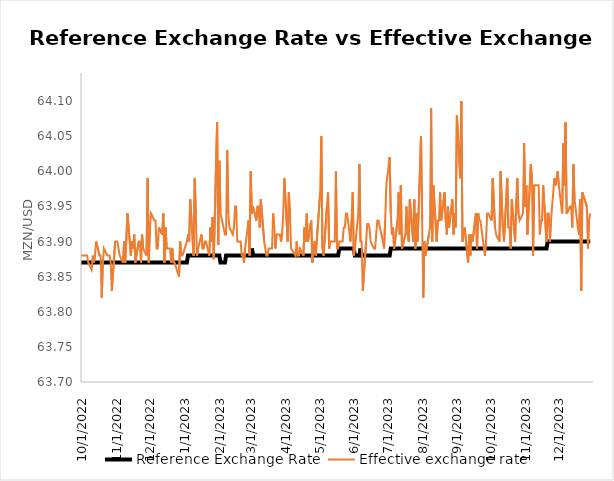
| Category | Reference Exchange Rate | Effective exchange rate |
|---|---|---|
| 10/1/21 | 63.83 | 63.8 |
| 10/5/21 | 63.83 | 63.83 |
| 10/6/21 | 63.83 | 63.76 |
| 10/7/21 | 63.83 | 63.82 |
| 10/8/21 | 63.83 | 63.82 |
| 10/11/21 | 63.83 | 63.77 |
| 10/12/21 | 63.83 | 63.81 |
| 10/13/21 | 63.83 | 63.82 |
| 10/14/21 | 63.83 | 63.82 |
| 10/15/21 | 63.83 | 63.82 |
| 10/18/21 | 63.83 | 63.76 |
| 10/19/21 | 63.83 | 63.76 |
| 10/20/21 | 63.83 | 63.82 |
| 10/21/21 | 63.83 | 63.78 |
| 10/22/21 | 63.83 | 63.81 |
| 10/25/21 | 63.83 | 63.82 |
| 10/26/21 | 63.83 | 63.79 |
| 10/27/21 | 63.83 | 63.8 |
| 10/28/21 | 63.83 | 63.83 |
| 10/29/21 | 63.83 | 63.82 |
| 11/1/21 | 63.83 | 63.84 |
| 11/2/21 | 63.83 | 63.81 |
| 11/3/21 | 63.83 | 63.83 |
| 11/4/21 | 63.83 | 63.82 |
| 11/5/21 | 63.83 | 63.83 |
| 11/8/21 | 63.83 | 63.79 |
| 11/9/21 | 63.83 | 63.79 |
| 11/11/21 | 63.83 | 63.84 |
| 11/12/21 | 63.83 | 63.83 |
| 11/15/21 | 63.83 | 63.78 |
| 11/16/21 | 63.83 | 63.7 |
| 11/17/21 | 63.83 | 63.84 |
| 11/18/21 | 63.83 | 63.81 |
| 11/19/21 | 63.83 | 63.8 |
| 11/22/21 | 63.83 | 63.78 |
| 11/23/21 | 63.83 | 63.81 |
| 11/24/21 | 63.83 | 63.81 |
| 11/25/21 | 63.83 | 63.81 |
| 11/26/21 | 63.83 | 63.84 |
| 11/29/21 | 63.83 | 63.8 |
| 11/30/21 | 63.83 | 63.81 |
| 12/1/21 | 63.83 | 63.79 |
| 12/2/21 | 63.83 | 63.79 |
| 12/3/21 | 63.83 | 63.82 |
| 12/6/21 | 63.83 | 63.75 |
| 12/7/21 | 63.83 | 63.78 |
| 12/8/21 | 63.83 | 63.82 |
| 12/9/21 | 63.83 | 63.82 |
| 12/10/21 | 63.83 | 63.82 |
| 12/13/21 | 63.83 | 63.83 |
| 12/14/21 | 63.83 | 63.76 |
| 12/15/21 | 63.83 | 63.82 |
| 12/16/21 | 63.83 | 63.8 |
| 12/17/21 | 63.83 | 63.79 |
| 12/20/21 | 63.83 | 63.84 |
| 12/21/21 | 63.83 | 63.79 |
| 12/22/21 | 63.83 | 63.8 |
| 12/23/21 | 63.83 | 63.82 |
| 12/27/21 | 63.83 | 63.77 |
| 12/28/21 | 63.83 | 63.74 |
| 12/29/21 | 63.83 | 63.76 |
| 12/30/21 | 63.83 | 63.78 |
| 12/31/21 | 63.83 | 63.72 |
| 1/3/22 | 63.83 | 63.79 |
| 1/4/22 | 63.83 | 63.81 |
| 1/5/22 | 63.83 | 63.8 |
| 1/6/22 | 63.83 | 63.81 |
| 1/7/22 | 63.83 | 63.77 |
| 1/10/22 | 63.83 | 63.79 |
| 1/12/22 | 63.83 | 63.83 |
| 1/13/22 | 63.83 | 63.83 |
| 1/14/22 | 63.83 | 63.83 |
| 1/17/22 | 63.83 | 63.83 |
| 1/18/22 | 63.83 | 63.83 |
| 1/19/22 | 63.83 | 63.8 |
| 1/20/22 | 63.83 | 63.83 |
| 1/21/22 | 63.83 | 63.83 |
| 1/24/22 | 63.83 | 63.81 |
| 1/25/22 | 63.83 | 63.82 |
| 1/26/22 | 63.83 | 63.83 |
| 1/27/22 | 63.83 | 63.8 |
| 1/28/22 | 63.83 | 63.83 |
| 1/31/22 | 63.83 | 63.81 |
| 2/1/22 | 63.83 | 63.83 |
| 2/2/22 | 63.83 | 63.82 |
| 2/3/22 | 63.83 | 63.78 |
| 2/4/22 | 63.83 | 63.84 |
| 2/7/22 | 63.83 | 63.83 |
| 2/8/22 | 63.83 | 63.85 |
| 2/9/22 | 63.83 | 63.8 |
| 2/10/22 | 63.83 | 63.83 |
| 2/11/22 | 63.83 | 63.83 |
| 2/14/22 | 63.83 | 63.83 |
| 2/15/22 | 63.83 | 63.81 |
| 2/16/22 | 63.83 | 63.81 |
| 2/17/22 | 63.83 | 63.83 |
| 2/18/22 | 63.83 | 63.83 |
| 2/21/22 | 63.83 | 63.84 |
| 2/22/22 | 63.83 | 63.83 |
| 2/23/22 | 63.83 | 63.83 |
| 2/24/22 | 63.83 | 63.81 |
| 2/25/22 | 63.83 | 63.82 |
| 2/28/22 | 63.83 | 63.83 |
| 3/1/22 | 63.83 | 63.79 |
| 3/2/22 | 63.83 | 63.81 |
| 3/3/22 | 63.83 | 63.83 |
| 3/4/22 | 63.83 | 63.83 |
| 3/7/22 | 63.83 | 63.82 |
| 3/8/22 | 63.83 | 63.83 |
| 3/9/22 | 63.83 | 63.76 |
| 3/10/22 | 63.83 | 63.82 |
| 3/11/22 | 63.83 | 63.83 |
| 3/14/22 | 63.83 | 63.83 |
| 3/15/22 | 63.83 | 63.82 |
| 3/16/22 | 63.83 | 63.82 |
| 3/17/22 | 63.83 | 63.82 |
| 3/18/22 | 63.83 | 63.84 |
| 3/21/22 | 63.83 | 63.8 |
| 3/22/22 | 63.83 | 63.8 |
| 3/23/22 | 63.83 | 63.82 |
| 3/24/22 | 63.83 | 63.84 |
| 3/25/22 | 63.83 | 63.83 |
| 3/28/22 | 63.83 | 63.73 |
| 3/29/22 | 63.83 | 63.88 |
| 3/30/22 | 63.83 | 63.82 |
| 3/31/22 | 63.83 | 63.84 |
| 4/1/22 | 63.83 | 63.83 |
| 4/4/22 | 63.83 | 63.83 |
| 4/5/22 | 63.83 | 63.84 |
| 4/6/22 | 63.83 | 63.83 |
| 4/8/22 | 63.83 | 63.83 |
| 4/11/22 | 63.83 | 63.83 |
| 4/12/22 | 63.83 | 63.77 |
| 4/13/22 | 63.83 | 63.83 |
| 4/14/22 | 63.83 | 63.83 |
| 4/18/22 | 63.83 | 63.83 |
| 4/19/22 | 63.83 | 63.83 |
| 4/20/22 | 63.83 | 63.84 |
| 4/21/22 | 63.83 | 63.85 |
| 4/22/22 | 63.83 | 63.83 |
| 4/25/20 | 63.83 | 63.81 |
| 4/26/22 | 63.83 | 63.83 |
| 4/27/22 | 63.83 | 63.82 |
| 4/28/22 | 63.83 | 63.83 |
| 4/29/22 | 63.83 | 63.83 |
| 5/3/22 | 63.83 | 63.83 |
| 5/4/22 | 63.83 | 63.84 |
| 5/5/22 | 63.83 | 63.82 |
| 5/6/22 | 63.83 | 63.82 |
| 5/9/22 | 63.83 | 63.82 |
| 5/10/22 | 63.83 | 63.83 |
| 5/11/22 | 63.83 | 63.83 |
| 5/12/22 | 63.83 | 63.79 |
| 5/13/22 | 63.83 | 63.83 |
| 5/16/22 | 63.83 | 63.85 |
| 5/17/22 | 63.83 | 63.82 |
| 5/18/22 | 63.83 | 63.83 |
| 5/19/22 | 63.83 | 63.83 |
| 5/20/22 | 63.83 | 63.84 |
| 5/23/22 | 63.83 | 63.84 |
| 5/24/22 | 63.83 | 63.83 |
| 5/25/22 | 63.84 | 63.79 |
| 5/26/22 | 63.84 | 63.87 |
| 5/27/22 | 63.84 | 63.91 |
| 5/30/22 | 63.84 | 63.8 |
| 5/31/22 | 63.84 | 63.84 |
| 6/1/22 | 63.84 | 63.85 |
| 6/2/22 | 63.84 | 63.84 |
| 6/3/22 | 63.84 | 63.85 |
| 6/6/22 | 63.85 | 63.86 |
| 6/7/22 | 63.85 | 63.84 |
| 6/8/22 | 63.85 | 63.85 |
| 6/9/22 | 63.85 | 63.83 |
| 6/10/22 | 63.85 | 63.85 |
| 6/13/22 | 63.85 | 63.84 |
| 6/14/22 | 63.85 | 63.85 |
| 6/15/22 | 63.85 | 63.85 |
| 6/16/22 | 63.85 | 63.85 |
| 6/17/22 | 63.85 | 63.84 |
| 6/20/22 | 63.85 | 63.82 |
| 6/21/22 | 63.86 | 63.86 |
| 6/22/22 | 63.86 | 63.83 |
| 6/23/22 | 63.86 | 63.86 |
| 6/24/22 | 63.86 | 63.86 |
| 6/27/22 | 63.86 | 63.87 |
| 6/28/22 | 63.86 | 63.85 |
| 6/29/22 | 63.86 | 63.86 |
| 6/30/22 | 63.86 | 63.83 |
| 7/1/22 | 63.86 | 63.85 |
| 7/4/22 | 63.86 | 63.86 |
| 7/5/22 | 63.86 | 63.87 |
| 7/6/22 | 63.86 | 63.87 |
| 7/7/22 | 63.86 | 63.89 |
| 7/8/22 | 63.86 | 63.86 |
| 7/11/22 | 63.86 | 63.88 |
| 7/12/22 | 63.86 | 63.87 |
| 7/13/22 | 63.86 | 63.86 |
| 7/14/22 | 63.86 | 63.86 |
| 7/15/22 | 63.86 | 63.89 |
| 7/18/22 | 63.86 | 63.94 |
| 7/19/22 | 63.86 | 63.91 |
| 7/20/22 | 63.86 | 63.87 |
| 7/21/22 | 63.86 | 63.92 |
| 7/22/22 | 63.86 | 63.84 |
| 7/25/22 | 63.87 | 63.88 |
| 7/26/22 | 63.87 | 63.89 |
| 7/27/22 | 63.87 | 63.87 |
| 7/28/22 | 63.87 | 63.87 |
| 7/29/22 | 63.87 | 63.86 |
| 8/1/22 | 63.87 | 63.83 |
| 8/2/22 | 63.87 | 63.87 |
| 8/3/22 | 63.87 | 63.89 |
| 8/4/22 | 63.87 | 63.87 |
| 8/5/22 | 63.87 | 63.87 |
| 8/8/22 | 63.87 | 63.9 |
| 8/9/22 | 63.87 | 63.87 |
| 8/10/22 | 63.87 | 63.88 |
| 8/11/22 | 63.87 | 63.88 |
| 8/12/22 | 63.87 | 63.88 |
| 8/15/22 | 63.87 | 63.87 |
| 8/16/22 | 63.87 | 63.88 |
| 8/17/22 | 63.87 | 63.89 |
| 8/18/22 | 63.87 | 63.82 |
| 8/19/22 | 63.87 | 63.88 |
| 8/22/22 | 63.87 | 63.92 |
| 8/23/22 | 63.87 | 63.87 |
| 8/24/22 | 63.87 | 63.88 |
| 8/25/22 | 63.87 | 63.87 |
| 8/26/22 | 63.87 | 63.82 |
| 8/29/22 | 63.87 | 63.89 |
| 8/30/22 | 63.87 | 63.88 |
| 9/1/22 | 63.87 | 63.92 |
| 9/2/22 | 63.87 | 63.91 |
| 9/5/22 | 63.87 | 63.88 |
| 9/6/22 | 63.87 | 63.87 |
| 9/8/22 | 63.87 | 63.89 |
| 9/9/22 | 63.87 | 63.82 |
| 9/12/22 | 63.87 | 63.89 |
| 9/13/22 | 63.87 | 63.89 |
| 9/14/22 | 63.87 | 63.88 |
| 9/15/22 | 63.87 | 63.89 |
| 9/16/22 | 63.87 | 63.91 |
| 9/19/22 | 63.87 | 63.89 |
| 9/20/22 | 63.87 | 63.89 |
| 9/21/22 | 63.87 | 63.87 |
| 9/22/22 | 63.87 | 63.91 |
| 9/23/22 | 63.87 | 63.88 |
| 9/27/22 | 63.87 | 63.87 |
| 9/28/22 | 63.87 | 63.78 |
| 9/29/22 | 63.87 | 63.87 |
| 9/30/22 | 63.87 | 63.88 |
| 10/3/22 | 63.87 | 63.88 |
| 10/5/22 | 63.87 | 63.88 |
| 10/6/22 | 63.87 | 63.88 |
| 10/7/22 | 63.87 | 63.87 |
| 10/10/22 | 63.87 | 63.86 |
| 10/11/22 | 63.87 | 63.88 |
| 10/12/22 | 63.87 | 63.87 |
| 10/13/22 | 63.87 | 63.88 |
| 10/14/22 | 63.87 | 63.9 |
| 10/17/22 | 63.87 | 63.88 |
| 10/18/22 | 63.87 | 63.88 |
| 10/19/22 | 63.87 | 63.82 |
| 10/20/22 | 63.87 | 63.87 |
| 10/21/22 | 63.87 | 63.89 |
| 10/24/22 | 63.87 | 63.88 |
| 10/25/22 | 63.87 | 63.88 |
| 10/26/22 | 63.87 | 63.88 |
| 10/27/22 | 63.87 | 63.87 |
| 10/28/22 | 63.87 | 63.83 |
| 10/31/22 | 63.87 | 63.9 |
| 11/1/22 | 63.87 | 63.9 |
| 11/2/22 | 63.87 | 63.9 |
| 11/3/22 | 63.87 | 63.89 |
| 11/4/22 | 63.87 | 63.88 |
| 11/7/22 | 63.87 | 63.87 |
| 11/8/22 | 63.87 | 63.9 |
| 11/9/22 | 63.87 | 63.87 |
| 11/11/22 | 63.87 | 63.94 |
| 11/14/22 | 63.87 | 63.88 |
| 11/15/22 | 63.87 | 63.9 |
| 11/16/22 | 63.87 | 63.89 |
| 11/17/22 | 63.87 | 63.91 |
| 11/18/22 | 63.87 | 63.87 |
| 11/21/22 | 63.87 | 63.9 |
| 11/22/22 | 63.87 | 63.9 |
| 11/23/22 | 63.87 | 63.87 |
| 11/24/22 | 63.87 | 63.91 |
| 11/25/22 | 63.87 | 63.89 |
| 11/28/22 | 63.87 | 63.88 |
| 11/29/22 | 63.87 | 63.99 |
| 11/30/22 | 63.87 | 63.87 |
| 12/1/22 | 63.87 | 63.92 |
| 12/2/22 | 63.87 | 63.94 |
| 12/5/22 | 63.87 | 63.93 |
| 12/6/22 | 63.87 | 63.93 |
| 12/7/22 | 63.87 | 63.89 |
| 12/8/22 | 63.87 | 63.89 |
| 12/9/22 | 63.87 | 63.92 |
| 12/12/22 | 63.87 | 63.91 |
| 12/13/22 | 63.87 | 63.94 |
| 12/14/22 | 63.87 | 63.87 |
| 12/15/22 | 63.87 | 63.92 |
| 12/16/22 | 63.87 | 63.89 |
| 12/19/22 | 63.87 | 63.89 |
| 12/20/22 | 63.87 | 63.87 |
| 12/21/22 | 63.87 | 63.89 |
| 12/22/22 | 63.87 | 63.87 |
| 12/23/22 | 63.87 | 63.87 |
| 12/27/22 | 63.87 | 63.85 |
| 12/28/22 | 63.87 | 63.9 |
| 12/29/22 | 63.87 | 63.88 |
| 12/30/22 | 63.87 | 63.88 |
| 1/3/23 | 63.87 | 63.9 |
| 1/4/23 | 63.88 | 63.91 |
| 1/5/23 | 63.88 | 63.9 |
| 1/6/23 | 63.88 | 63.96 |
| 1/9/23 | 63.88 | 63.88 |
| 1/10/23 | 63.88 | 63.99 |
| 1/11/23 | 63.88 | 63.94 |
| 1/12/23 | 63.88 | 63.88 |
| 1/13/23 | 63.88 | 63.89 |
| 1/16/23 | 63.88 | 63.91 |
| 1/17/23 | 63.88 | 63.89 |
| 1/18/23 | 63.88 | 63.89 |
| 1/19/23 | 63.88 | 63.9 |
| 1/20/23 | 63.88 | 63.9 |
| 1/23/23 | 63.88 | 63.88 |
| 1/24/23 | 63.88 | 63.92 |
| 1/25/23 | 63.88 | 63.9 |
| 1/26/23 | 63.88 | 63.935 |
| 1/27/23 | 63.88 | 63.875 |
| 1/30/23 | 63.88 | 64.07 |
| 1/31/23 | 63.88 | 63.895 |
| 2/1/23 | 63.88 | 64.015 |
| 2/2/23 | 63.87 | 63.94 |
| 2/6/23 | 63.87 | 63.91 |
| 2/7/23 | 63.88 | 63.91 |
| 2/8/23 | 63.88 | 64.03 |
| 2/9/23 | 63.88 | 63.94 |
| 2/10/23 | 63.88 | 63.92 |
| 2/13/23 | 63.88 | 63.91 |
| 2/14/23 | 63.88 | 63.92 |
| 2/15/23 | 63.88 | 63.95 |
| 2/16/23 | 63.88 | 63.95 |
| 2/17/23 | 63.88 | 63.9 |
| 2/20/23 | 63.88 | 63.9 |
| 2/21/23 | 63.88 | 63.88 |
| 2/22/23 | 63.88 | 63.88 |
| 2/23/23 | 63.88 | 63.87 |
| 2/24/23 | 63.88 | 63.89 |
| 2/27/23 | 63.88 | 63.93 |
| 2/28/23 | 63.88 | 63.88 |
| 3/1/23 | 63.88 | 64 |
| 3/2/23 | 63.89 | 63.94 |
| 3/3/23 | 63.88 | 63.95 |
| 3/6/23 | 63.88 | 63.93 |
| 3/7/23 | 63.88 | 63.95 |
| 3/8/23 | 63.88 | 63.95 |
| 3/9/23 | 63.88 | 63.92 |
| 3/10/23 | 63.88 | 63.96 |
| 3/13/23 | 63.88 | 63.9 |
| 3/14/23 | 63.88 | 63.89 |
| 3/15/23 | 63.88 | 63.88 |
| 3/16/23 | 63.88 | 63.88 |
| 3/17/23 | 63.88 | 63.89 |
| 3/20/23 | 63.88 | 63.89 |
| 3/21/23 | 63.88 | 63.94 |
| 3/22/23 | 63.88 | 63.92 |
| 3/23/23 | 63.88 | 63.89 |
| 3/24/23 | 63.88 | 63.91 |
| 3/27/23 | 63.88 | 63.91 |
| 3/28/23 | 63.88 | 63.9 |
| 3/29/23 | 63.88 | 63.91 |
| 3/30/23 | 63.88 | 63.94 |
| 3/31/23 | 63.88 | 63.99 |
| 4/3/23 | 63.88 | 63.9 |
| 4/4/23 | 63.88 | 63.97 |
| 4/5/23 | 63.88 | 63.94 |
| 4/6/23 | 63.88 | 63.89 |
| 4/10/23 | 63.88 | 63.88 |
| 4/11/23 | 63.88 | 63.9 |
| 4/12/23 | 63.88 | 63.88 |
| 4/13/23 | 63.88 | 63.88 |
| 4/14/23 | 63.88 | 63.89 |
| 4/17/23 | 63.88 | 63.88 |
| 4/18/23 | 63.88 | 63.92 |
| 4/19/23 | 63.88 | 63.9 |
| 4/20/23 | 63.88 | 63.94 |
| 4/21/23 | 63.88 | 63.9 |
| 4/24/23 | 63.88 | 63.93 |
| 4/25/23 | 63.88 | 63.87 |
| 4/26/23 | 63.88 | 63.89 |
| 4/27/23 | 63.88 | 63.9 |
| 4/28/23 | 63.88 | 63.88 |
| 5/2/23 | 63.88 | 63.97 |
| 5/3/23 | 63.88 | 64.05 |
| 5/4/23 | 63.88 | 63.89 |
| 5/5/23 | 63.88 | 63.88 |
| 5/8/23 | 63.88 | 63.95 |
| 5/9/23 | 63.88 | 63.97 |
| 5/10/23 | 63.88 | 63.89 |
| 5/11/23 | 63.88 | 63.9 |
| 5/12/23 | 63.88 | 63.9 |
| 5/15/23 | 63.88 | 63.9 |
| 5/16/23 | 63.88 | 64 |
| 5/17/23 | 63.88 | 63.89 |
| 5/18/23 | 63.88 | 63.89 |
| 5/19/23 | 63.89 | 63.9 |
| 5/22/23 | 63.89 | 63.9 |
| 5/23/23 | 63.89 | 63.92 |
| 5/24/23 | 63.89 | 63.92 |
| 5/25/23 | 63.89 | 63.94 |
| 5/26/23 | 63.89 | 63.94 |
| 5/29/23 | 63.89 | 63.9 |
| 5/30/23 | 63.89 | 63.93 |
| 5/31/23 | 63.89 | 63.97 |
| 6/1/23 | 63.89 | 63.88 |
| 6/2/23 | 63.88 | 63.89 |
| 6/5/23 | 63.88 | 63.94 |
| 6/6/23 | 63.88 | 64.01 |
| 6/7/23 | 63.89 | 63.9 |
| 6/8/23 | 63.88 | 63.9 |
| 6/9/23 | 63.88 | 63.83 |
| 6/12/23 | 63.88 | 63.9 |
| 6/13/23 | 63.88 | 63.925 |
| 6/14/23 | 63.88 | 63.925 |
| 6/15/23 | 63.88 | 63.92 |
| 6/16/23 | 63.88 | 63.9 |
| 6/19/23 | 63.88 | 63.89 |
| 6/20/23 | 63.88 | 63.89 |
| 6/21/23 | 63.88 | 63.91 |
| 6/22/23 | 63.88 | 63.93 |
| 6/23/23 | 63.88 | 63.93 |
| 6/27/23 | 63.88 | 63.9 |
| 6/28/23 | 63.88 | 63.89 |
| 6/29/23 | 63.88 | 63.93 |
| 6/30/23 | 63.88 | 63.98 |
| 7/3/23 | 63.88 | 64.02 |
| 7/4/23 | 63.89 | 63.94 |
| 7/5/23 | 63.89 | 63.91 |
| 7/6/23 | 63.89 | 63.92 |
| 7/7/23 | 63.89 | 63.89 |
| 7/10/23 | 63.89 | 63.93 |
| 7/11/23 | 63.89 | 63.97 |
| 7/12/23 | 63.89 | 63.91 |
| 7/13/23 | 63.89 | 63.98 |
| 7/14/23 | 63.89 | 63.89 |
| 7/17/23 | 63.89 | 63.91 |
| 7/18/23 | 63.89 | 63.95 |
| 7/19/23 | 63.89 | 63.91 |
| 7/20/23 | 63.89 | 63.9 |
| 7/21/23 | 63.89 | 63.96 |
| 7/24/23 | 63.89 | 63.9 |
| 7/25/23 | 63.89 | 63.96 |
| 7/26/23 | 63.89 | 63.89 |
| 7/27/23 | 63.89 | 63.94 |
| 7/28/23 | 63.89 | 63.9 |
| 7/31/23 | 63.89 | 64.05 |
| 8/1/23 | 63.89 | 63.93 |
| 8/2/23 | 63.89 | 63.82 |
| 8/3/23 | 63.89 | 63.9 |
| 8/4/23 | 63.89 | 63.88 |
| 8/7/23 | 63.89 | 63.91 |
| 8/8/23 | 63.89 | 63.92 |
| 8/9/23 | 63.89 | 64.09 |
| 8/10/23 | 63.89 | 63.9 |
| 8/11/23 | 63.89 | 63.98 |
| 8/14/23 | 63.89 | 63.9 |
| 8/15/23 | 63.89 | 63.93 |
| 8/16/23 | 63.89 | 63.93 |
| 8/17/23 | 63.89 | 63.97 |
| 8/18/23 | 63.89 | 63.93 |
| 8/21/23 | 63.89 | 63.97 |
| 8/22/23 | 63.89 | 63.93 |
| 8/23/23 | 63.89 | 63.91 |
| 8/24/23 | 63.89 | 63.95 |
| 8/25/23 | 63.89 | 63.92 |
| 8/28/23 | 63.89 | 63.96 |
| 8/29/23 | 63.89 | 63.91 |
| 8/30/23 | 63.89 | 63.94 |
| 8/31/23 | 63.89 | 63.92 |
| 9/1/23 | 63.89 | 64.08 |
| 9/4/23 | 63.89 | 63.99 |
| 9/5/23 | 63.89 | 64.1 |
| 9/6/23 | 63.89 | 63.9 |
| 9/8/23 | 63.89 | 63.92 |
| 9/11/23 | 63.89 | 63.87 |
| 9/12/23 | 63.89 | 63.91 |
| 9/13/23 | 63.89 | 63.88 |
| 9/14/23 | 63.89 | 63.91 |
| 9/15/23 | 63.89 | 63.9 |
| 9/18/23 | 63.89 | 63.94 |
| 9/19/23 | 63.89 | 63.89 |
| 9/20/23 | 63.89 | 63.94 |
| 9/21/23 | 63.89 | 63.93 |
| 9/22/23 | 63.89 | 63.93 |
| 9/26/23 | 63.89 | 63.88 |
| 9/27/23 | 63.89 | 63.9 |
| 9/28/23 | 63.89 | 63.94 |
| 9/29/23 | 63.89 | 63.94 |
| 10/2/23 | 63.89 | 63.93 |
| 10/3/23 | 63.89 | 63.99 |
| 10/5/23 | 63.89 | 63.92 |
| 10/6/23 | 63.89 | 63.91 |
| 10/9/23 | 63.89 | 63.9 |
| 10/10/23 | 63.89 | 64 |
| 10/12/23 | 63.89 | 63.92 |
| 10/13/23 | 63.89 | 63.9 |
| 10/16/23 | 63.89 | 63.99 |
| 10/17/23 | 63.89 | 63.92 |
| 10/18/23 | 63.89 | 63.92 |
| 10/19/23 | 63.89 | 63.89 |
| 10/20/23 | 63.89 | 63.96 |
| 10/23/23 | 63.89 | 63.9 |
| 10/24/23 | 63.89 | 63.96 |
| 10/25/23 | 63.89 | 63.99 |
| 10/26/23 | 63.89 | 63.94 |
| 10/27/23 | 63.89 | 63.93 |
| 10/30/23 | 63.89 | 63.94 |
| 10/31/23 | 63.89 | 64.04 |
| 11/1/23 | 63.89 | 63.95 |
| 11/2/23 | 63.89 | 63.98 |
| 11/3/23 | 63.89 | 63.91 |
| 11/6/23 | 63.89 | 64.01 |
| 11/7/23 | 63.89 | 63.99 |
| 11/8/23 | 63.89 | 63.88 |
| 11/9/23 | 63.89 | 63.98 |
| 11/13/23 | 63.89 | 63.98 |
| 11/14/23 | 63.89 | 63.91 |
| 11/15/23 | 63.89 | 63.93 |
| 11/16/23 | 63.89 | 63.93 |
| 11/17/23 | 63.89 | 63.98 |
| 11/20/23 | 63.89 | 63.9 |
| 11/21/23 | 63.9 | 63.94 |
| 11/22/23 | 63.9 | 63.94 |
| 11/23/23 | 63.9 | 63.9 |
| 11/24/23 | 63.9 | 63.93 |
| 11/27/23 | 63.9 | 63.99 |
| 11/28/23 | 63.9 | 63.98 |
| 11/29/23 | 63.9 | 63.99 |
| 11/30/23 | 63.9 | 64 |
| 12/1/23 | 63.9 | 63.98 |
| 12/4/23 | 63.9 | 63.94 |
| 12/5/23 | 63.9 | 64.04 |
| 12/6/23 | 63.9 | 63.98 |
| 12/7/23 | 63.9 | 64.07 |
| 12/8/23 | 63.9 | 63.94 |
| 12/11/23 | 63.9 | 63.95 |
| 12/12/23 | 63.9 | 63.95 |
| 12/13/23 | 63.9 | 63.92 |
| 12/14/23 | 63.9 | 64.01 |
| 12/15/23 | 63.9 | 63.96 |
| 12/18/23 | 63.9 | 63.92 |
| 12/19/23 | 63.9 | 63.91 |
| 12/20/23 | 63.9 | 63.96 |
| 12/21/23 | 63.9 | 63.83 |
| 12/22/23 | 63.9 | 63.97 |
| 12/26/23 | 63.9 | 63.95 |
| 12/27/23 | 63.9 | 63.89 |
| 12/28/23 | 63.9 | 63.93 |
| 12/29/23 | 63.9 | 63.94 |